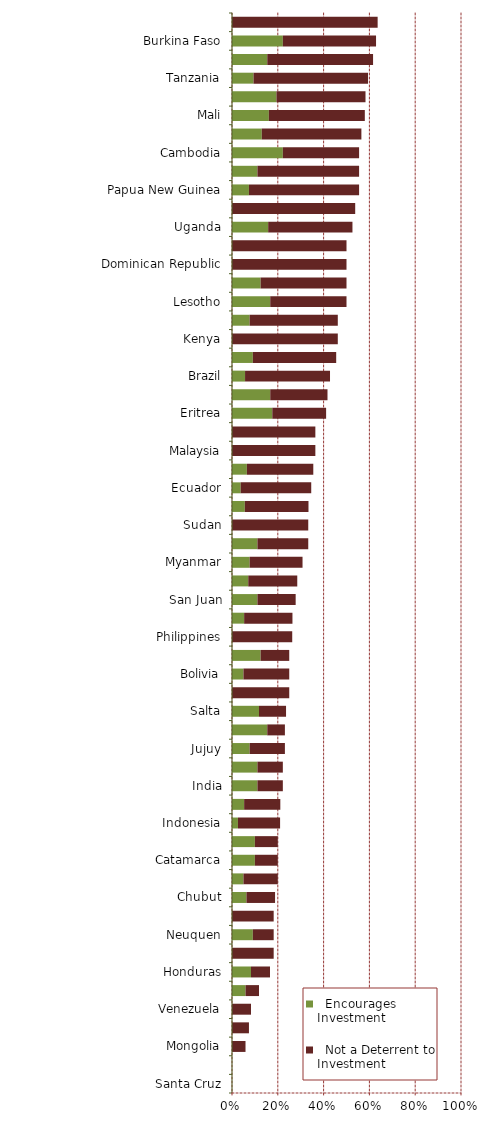
| Category |   Encourages Investment |   Not a Deterrent to Investment |
|---|---|---|
| Santa Cruz | 0 | 0 |
| Kyrgyzstan | 0 | 0 |
| Mongolia | 0 | 0.059 |
| Zimbabwe | 0 | 0.074 |
| Venezuela | 0 | 0.083 |
| Mendoza | 0.059 | 0.059 |
| Honduras | 0.083 | 0.083 |
| South Sudan | 0 | 0.182 |
| Neuquen | 0.091 | 0.091 |
| Kazakhstan | 0 | 0.182 |
| Chubut | 0.063 | 0.125 |
| Guinea (Conakry) | 0.05 | 0.15 |
| Catamarca | 0.1 | 0.1 |
| La Rioja | 0.1 | 0.1 |
| Indonesia | 0.026 | 0.184 |
| China | 0.053 | 0.158 |
| India | 0.111 | 0.111 |
| Vietnam | 0.111 | 0.111 |
| Jujuy | 0.077 | 0.154 |
| Rio Negro | 0.154 | 0.077 |
| Salta | 0.118 | 0.118 |
| Nigeria | 0 | 0.25 |
| Bolivia | 0.05 | 0.2 |
| Thailand | 0.125 | 0.125 |
| Philippines | 0 | 0.263 |
| Niger | 0.053 | 0.211 |
| San Juan | 0.111 | 0.167 |
| Russia | 0.071 | 0.214 |
| Myanmar | 0.077 | 0.231 |
| Solomon Islands | 0.111 | 0.222 |
| Sudan | 0 | 0.333 |
| Madagascar | 0.056 | 0.278 |
| Ecuador | 0.038 | 0.308 |
| Democratic Republic of Congo (DRC) | 0.065 | 0.29 |
| Malaysia | 0 | 0.364 |
| Ethiopia | 0 | 0.364 |
| Eritrea | 0.176 | 0.235 |
| Angola | 0.167 | 0.25 |
| Brazil | 0.057 | 0.371 |
| Egypt | 0.091 | 0.364 |
| Kenya | 0 | 0.462 |
| Mozambique | 0.077 | 0.385 |
| Lesotho | 0.167 | 0.333 |
| South Africa | 0.125 | 0.375 |
| Dominican Republic | 0 | 0.5 |
| Laos | 0 | 0.5 |
| Uganda | 0.158 | 0.368 |
| Sierra Leone | 0 | 0.538 |
| Papua New Guinea | 0.074 | 0.481 |
| Mauritania | 0.111 | 0.444 |
| Cambodia | 0.222 | 0.333 |
| Ivory Coast | 0.13 | 0.435 |
| Mali | 0.161 | 0.419 |
| Colombia | 0.194 | 0.389 |
| Tanzania | 0.094 | 0.5 |
| Fiji | 0.154 | 0.462 |
| Burkina Faso | 0.222 | 0.407 |
| Central African Republic | 0 | 0.636 |